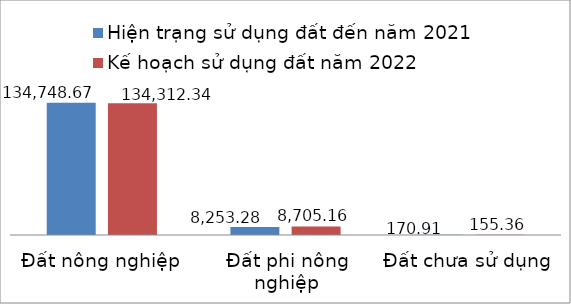
| Category | Hiện trạng sử dụng đất đến năm 2021  | Kế hoạch sử dụng đất năm 2022 |
|---|---|---|
| Đất nông nghiệp | 134748.67 | 134312.34 |
| Đất phi nông nghiệp | 8253.28 | 8705.16 |
| Đất chưa sử dụng | 170.91 | 155.36 |